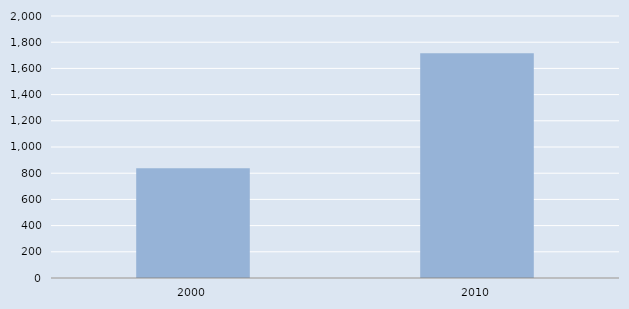
| Category | Series 0 |
|---|---|
| 2000.0 | 838 |
| 2010.0 | 1716 |